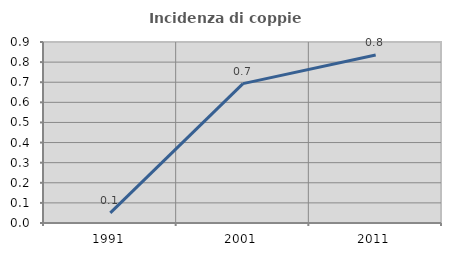
| Category | Incidenza di coppie miste |
|---|---|
| 1991.0 | 0.05 |
| 2001.0 | 0.693 |
| 2011.0 | 0.835 |